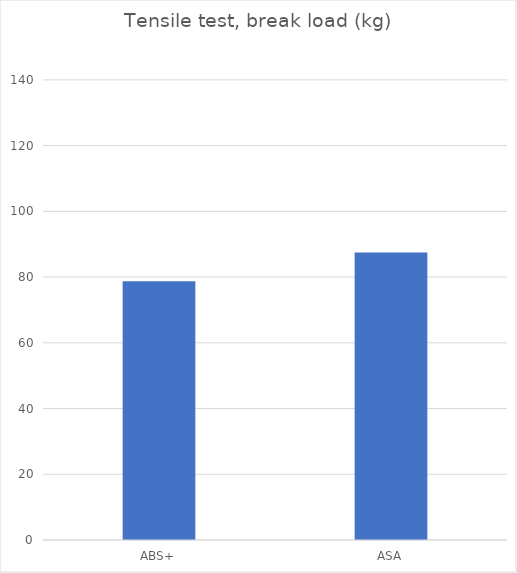
| Category | Average |
|---|---|
| ABS+ | 78.7 |
| ASA | 87.5 |